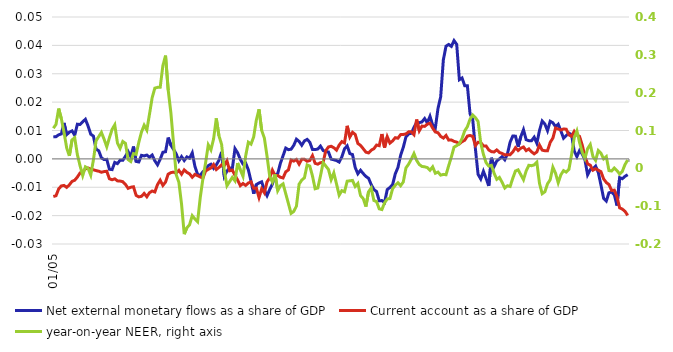
| Category | Net external monetary flows as a share of GDP | Current account as a share of GDP |
|---|---|---|
| 2005-01-01 | 0.008 | -0.013 |
| 2005-02-01 | 0.008 | -0.013 |
| 2005-03-01 | 0.008 | -0.011 |
| 2005-04-01 | 0.009 | -0.01 |
| 2005-05-01 | 0.013 | -0.009 |
| 2005-06-01 | 0.009 | -0.01 |
| 2005-07-01 | 0.009 | -0.009 |
| 2005-08-01 | 0.01 | -0.008 |
| 2005-09-01 | 0.008 | -0.008 |
| 2005-10-01 | 0.012 | -0.006 |
| 2005-11-01 | 0.012 | -0.005 |
| 2005-12-01 | 0.013 | -0.004 |
| 2006-01-01 | 0.014 | -0.004 |
| 2006-02-01 | 0.012 | -0.003 |
| 2006-03-01 | 0.009 | -0.004 |
| 2006-04-01 | 0.008 | -0.004 |
| 2006-05-01 | 0.003 | -0.004 |
| 2006-06-01 | 0.003 | -0.004 |
| 2006-07-01 | 0 | -0.005 |
| 2006-08-01 | 0 | -0.004 |
| 2006-09-01 | 0 | -0.004 |
| 2006-10-01 | -0.004 | -0.007 |
| 2006-11-01 | -0.004 | -0.007 |
| 2006-12-01 | -0.001 | -0.007 |
| 2007-01-01 | -0.002 | -0.008 |
| 2007-02-01 | 0 | -0.008 |
| 2007-03-01 | -0.001 | -0.008 |
| 2007-04-01 | 0.001 | -0.009 |
| 2007-05-01 | 0.003 | -0.01 |
| 2007-06-01 | 0.001 | -0.01 |
| 2007-07-01 | 0.004 | -0.01 |
| 2007-08-01 | -0.001 | -0.013 |
| 2007-09-01 | -0.001 | -0.013 |
| 2007-10-01 | 0.001 | -0.013 |
| 2007-11-01 | 0.001 | -0.012 |
| 2007-12-01 | 0.001 | -0.013 |
| 2008-01-01 | 0.001 | -0.012 |
| 2008-02-01 | 0.001 | -0.011 |
| 2008-03-01 | -0.001 | -0.012 |
| 2008-04-01 | -0.002 | -0.009 |
| 2008-05-01 | 0 | -0.008 |
| 2008-06-01 | 0.002 | -0.009 |
| 2008-07-01 | 0.003 | -0.008 |
| 2008-08-01 | 0.008 | -0.005 |
| 2008-09-01 | 0.005 | -0.005 |
| 2008-10-01 | 0.003 | -0.005 |
| 2008-11-01 | 0.002 | -0.005 |
| 2008-12-01 | -0.001 | -0.004 |
| 2009-01-01 | 0.001 | -0.005 |
| 2009-02-01 | -0.001 | -0.004 |
| 2009-03-01 | 0.001 | -0.005 |
| 2009-04-01 | 0 | -0.005 |
| 2009-05-01 | 0.002 | -0.006 |
| 2009-06-01 | -0.003 | -0.005 |
| 2009-07-01 | -0.005 | -0.006 |
| 2009-08-01 | -0.006 | -0.006 |
| 2009-09-01 | -0.005 | -0.007 |
| 2009-10-01 | -0.004 | -0.004 |
| 2009-11-01 | -0.002 | -0.004 |
| 2009-12-01 | -0.002 | -0.003 |
| 2010-01-01 | -0.003 | -0.002 |
| 2010-02-01 | -0.002 | -0.004 |
| 2010-03-01 | 0 | -0.003 |
| 2010-04-01 | 0.002 | -0.002 |
| 2010-05-01 | -0.006 | -0.002 |
| 2010-06-01 | -0.004 | -0.001 |
| 2010-07-01 | -0.003 | -0.004 |
| 2010-08-01 | -0.003 | -0.004 |
| 2010-09-01 | 0.004 | -0.006 |
| 2010-10-01 | 0.002 | -0.008 |
| 2010-11-01 | 0 | -0.009 |
| 2010-12-01 | -0.002 | -0.009 |
| 2011-01-01 | -0.001 | -0.009 |
| 2011-02-01 | -0.004 | -0.008 |
| 2011-03-01 | -0.008 | -0.008 |
| 2011-04-01 | -0.012 | -0.01 |
| 2011-05-01 | -0.009 | -0.01 |
| 2011-06-01 | -0.008 | -0.014 |
| 2011-07-01 | -0.008 | -0.011 |
| 2011-08-01 | -0.011 | -0.012 |
| 2011-09-01 | -0.013 | -0.008 |
| 2011-10-01 | -0.011 | -0.007 |
| 2011-11-01 | -0.009 | -0.004 |
| 2011-12-01 | -0.006 | -0.006 |
| 2012-01-01 | -0.005 | -0.006 |
| 2012-02-01 | -0.002 | -0.006 |
| 2012-03-01 | 0.001 | -0.007 |
| 2012-04-01 | 0.004 | -0.005 |
| 2012-05-01 | 0.003 | -0.004 |
| 2012-06-01 | 0.003 | 0 |
| 2012-07-01 | 0.005 | -0.001 |
| 2012-08-01 | 0.007 | 0 |
| 2012-09-01 | 0.006 | -0.002 |
| 2012-10-01 | 0.005 | 0 |
| 2012-11-01 | 0.006 | 0 |
| 2012-12-01 | 0.007 | -0.001 |
| 2013-01-01 | 0.006 | -0.001 |
| 2013-02-01 | 0.003 | 0.001 |
| 2013-03-01 | 0.003 | -0.002 |
| 2013-04-01 | 0.003 | -0.002 |
| 2013-05-01 | 0.004 | -0.001 |
| 2013-06-01 | 0.003 | -0.001 |
| 2013-07-01 | 0.003 | 0.003 |
| 2013-08-01 | 0.002 | 0.004 |
| 2013-09-01 | 0 | 0.004 |
| 2013-10-01 | 0 | 0.004 |
| 2013-11-01 | -0.001 | 0.003 |
| 2013-12-01 | -0.001 | 0.005 |
| 2014-01-01 | 0.001 | 0.006 |
| 2014-02-01 | 0.004 | 0.006 |
| 2014-03-01 | 0.005 | 0.012 |
| 2014-04-01 | 0.002 | 0.008 |
| 2014-05-01 | 0.002 | 0.009 |
| 2014-06-01 | -0.003 | 0.009 |
| 2014-07-01 | -0.005 | 0.005 |
| 2014-08-01 | -0.004 | 0.005 |
| 2014-09-01 | -0.005 | 0.004 |
| 2014-10-01 | -0.006 | 0.002 |
| 2014-11-01 | -0.007 | 0.002 |
| 2014-12-01 | -0.009 | 0.003 |
| 2015-01-01 | -0.011 | 0.004 |
| 2015-02-01 | -0.012 | 0.005 |
| 2015-03-01 | -0.015 | 0.005 |
| 2015-04-01 | -0.015 | 0.009 |
| 2015-05-01 | -0.015 | 0.004 |
| 2015-06-01 | -0.011 | 0.008 |
| 2015-07-01 | -0.01 | 0.006 |
| 2015-08-01 | -0.009 | 0.006 |
| 2015-09-01 | -0.005 | 0.007 |
| 2015-10-01 | -0.003 | 0.007 |
| 2015-11-01 | 0.001 | 0.009 |
| 2015-12-01 | 0.004 | 0.009 |
| 2016-01-01 | 0.008 | 0.009 |
| 2016-02-01 | 0.009 | 0.01 |
| 2016-03-01 | 0.009 | 0.01 |
| 2016-04-01 | 0.011 | 0.009 |
| 2016-05-01 | 0.013 | 0.014 |
| 2016-06-01 | 0.013 | 0.01 |
| 2016-07-01 | 0.013 | 0.012 |
| 2016-08-01 | 0.014 | 0.011 |
| 2016-09-01 | 0.013 | 0.012 |
| 2016-10-01 | 0.015 | 0.013 |
| 2016-11-01 | 0.012 | 0.011 |
| 2016-12-01 | 0.011 | 0.009 |
| 2017-01-01 | 0.018 | 0.009 |
| 2017-02-01 | 0.022 | 0.008 |
| 2017-03-01 | 0.035 | 0.007 |
| 2017-04-01 | 0.04 | 0.008 |
| 2017-05-01 | 0.04 | 0.007 |
| 2017-06-01 | 0.04 | 0.007 |
| 2017-07-01 | 0.042 | 0.006 |
| 2017-08-01 | 0.04 | 0.006 |
| 2017-09-01 | 0.028 | 0.005 |
| 2017-10-01 | 0.028 | 0.006 |
| 2017-11-01 | 0.026 | 0.007 |
| 2017-12-01 | 0.026 | 0.008 |
| 2018-01-01 | 0.016 | 0.008 |
| 2018-02-01 | 0.014 | 0.008 |
| 2018-03-01 | 0.004 | 0.005 |
| 2018-04-01 | -0.005 | 0.006 |
| 2018-05-01 | -0.007 | 0.006 |
| 2018-06-01 | -0.004 | 0.005 |
| 2018-07-01 | -0.007 | 0.005 |
| 2018-08-01 | -0.01 | 0.003 |
| 2018-09-01 | 0 | 0.003 |
| 2018-10-01 | -0.003 | 0.002 |
| 2018-11-01 | -0.001 | 0.003 |
| 2018-12-01 | 0 | 0.002 |
| 2019-01-01 | 0.001 | 0.002 |
| 2019-02-01 | 0 | 0.001 |
| 2019-03-01 | 0.002 | 0.001 |
| 2019-04-01 | 0.006 | 0.001 |
| 2019-05-01 | 0.008 | 0.002 |
| 2019-06-01 | 0.008 | 0.004 |
| 2019-07-01 | 0.004 | 0.003 |
| 2019-08-01 | 0.008 | 0.004 |
| 2019-09-01 | 0.01 | 0.004 |
| 2019-10-01 | 0.007 | 0.003 |
| 2019-11-01 | 0.006 | 0.004 |
| 2019-12-01 | 0.006 | 0.002 |
| 2020-01-01 | 0.008 | 0.002 |
| 2020-02-01 | 0.006 | 0.002 |
| 2020-03-01 | 0.01 | 0.005 |
| 2020-04-01 | 0.013 | 0.003 |
| 2020-05-01 | 0.012 | 0.003 |
| 2020-06-01 | 0.01 | 0.003 |
| 2020-07-01 | 0.013 | 0.006 |
| 2020-08-01 | 0.013 | 0.007 |
| 2020-09-01 | 0.011 | 0.011 |
| 2020-10-01 | 0.012 | 0.011 |
| 2020-11-01 | 0.01 | 0.01 |
| 2020-12-01 | 0.007 | 0.011 |
| 2021-01-01 | 0.008 | 0.01 |
| 2021-02-01 | 0.009 | 0.008 |
| 2021-03-01 | 0.008 | 0.008 |
| 2021-04-01 | 0.003 | 0.01 |
| 2021-05-01 | 0.001 | 0.008 |
| 2021-06-01 | 0.003 | 0.008 |
| 2021-07-01 | 0.002 | 0.005 |
| 2021-08-01 | 0 | 0.001 |
| 2021-09-01 | -0.006 | -0.002 |
| 2021-10-01 | -0.004 | -0.002 |
| 2021-11-01 | -0.004 | -0.004 |
| 2021-12-01 | -0.003 | -0.003 |
| 2022-01-01 | -0.005 | -0.004 |
| 2022-02-01 | -0.009 | -0.005 |
| 2022-03-01 | -0.014 | -0.007 |
| 2022-04-01 | -0.015 | -0.008 |
| 2022-05-01 | -0.012 | -0.009 |
| 2022-06-01 | -0.012 | -0.011 |
| 2022-07-01 | -0.013 | -0.011 |
| 2022-08-01 | -0.016 | -0.013 |
| 2022-09-01 | -0.007 | -0.017 |
| 2022-10-01 | -0.007 | -0.018 |
| 2022-11-01 | -0.006 | -0.018 |
| 2022-12-01 | -0.006 | -0.02 |